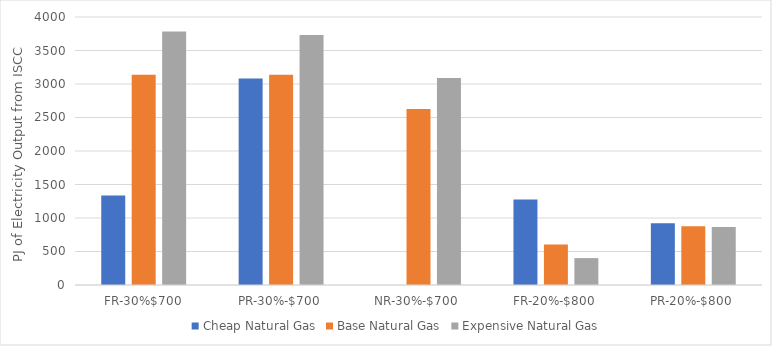
| Category | Cheap Natural Gas | Base Natural Gas | Expensive Natural Gas |
|---|---|---|---|
| FR-30%$700 | 1336.13 | 3138.06 | 3784.68 |
| PR-30%-$700 | 3080.52 | 3137.63 | 3732.79 |
| NR-30%-$700 | 0 | 2628.31 | 3090.51 |
| FR-20%-$800 | 1274.32 | 605.71 | 401.51 |
| PR-20%-$800 | 920.09 | 875.97 | 867.05 |